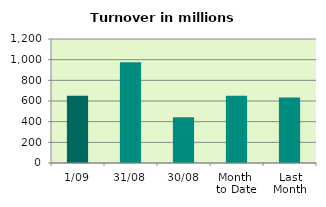
| Category | Series 0 |
|---|---|
| 1/09 | 649.962 |
| 31/08 | 975.097 |
| 30/08 | 443.395 |
| Month 
to Date | 649.962 |
| Last
Month | 632.895 |